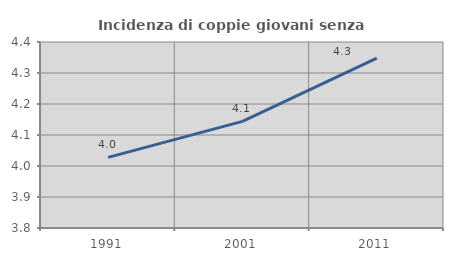
| Category | Incidenza di coppie giovani senza figli |
|---|---|
| 1991.0 | 4.028 |
| 2001.0 | 4.144 |
| 2011.0 | 4.348 |